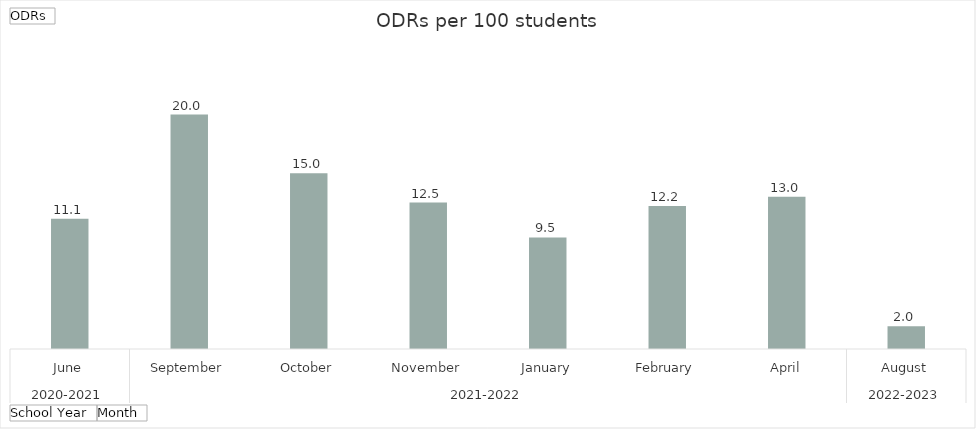
| Category | Total |
|---|---|
| 0 | 11.111 |
| 1 | 20 |
| 2 | 15 |
| 3 | 12.5 |
| 4 | 9.524 |
| 5 | 12.195 |
| 6 | 13 |
| 7 | 1.951 |